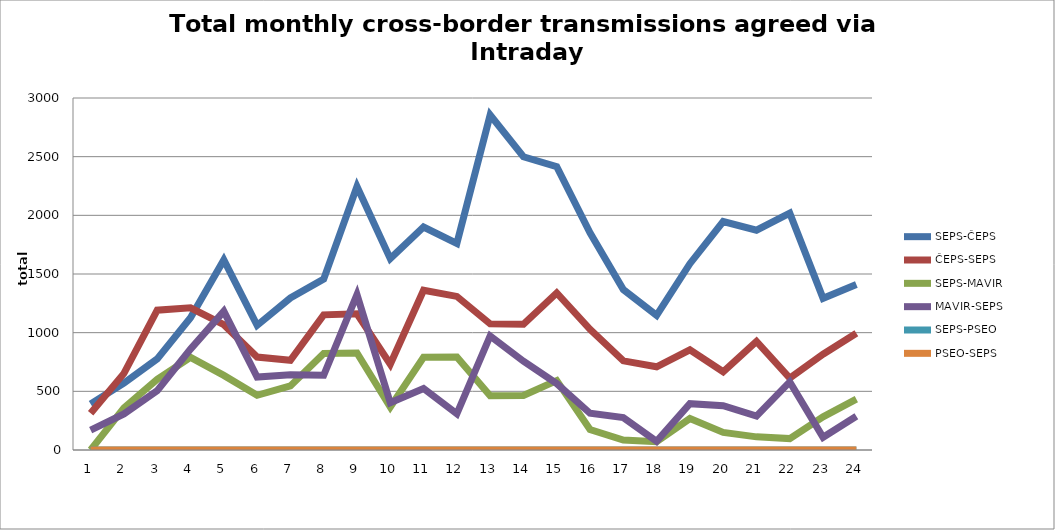
| Category | SEPS-ČEPS | ČEPS-SEPS | SEPS-MAVIR | MAVIR-SEPS | SEPS-PSEO | PSEO-SEPS |
|---|---|---|---|---|---|---|
| 1.0 | 392 | 313 | 0 | 169 | 0 | 0 |
| 2.0 | 571 | 653 | 359 | 308 | 0 | 0 |
| 3.0 | 776 | 1192 | 602 | 506 | 0 | 0 |
| 4.0 | 1127 | 1212 | 790 | 860 | 0 | 0 |
| 5.0 | 1620 | 1068 | 636 | 1182 | 0 | 0 |
| 6.0 | 1062 | 792 | 466 | 622 | 0 | 0 |
| 7.0 | 1296 | 764 | 546 | 641 | 0 | 0 |
| 8.0 | 1456 | 1152 | 823 | 637 | 0 | 0 |
| 9.0 | 2245 | 1161 | 827 | 1324 | 0 | 0 |
| 10.0 | 1631 | 731 | 366 | 402 | 0 | 0 |
| 11.0 | 1900 | 1362 | 791 | 524 | 0 | 0 |
| 12.0 | 1760 | 1309 | 793 | 308 | 0 | 0 |
| 13.0 | 2855 | 1075 | 463 | 972 | 0 | 0 |
| 14.0 | 2499 | 1072 | 464 | 757 | 0 | 0 |
| 15.0 | 2414 | 1338 | 591 | 566 | 0 | 0 |
| 16.0 | 1851 | 1028 | 174 | 313 | 0 | 0 |
| 17.0 | 1367 | 760 | 85 | 276 | 0 | 0 |
| 18.0 | 1148 | 709 | 71 | 74 | 0 | 0 |
| 19.0 | 1588 | 854 | 268 | 395 | 0 | 0 |
| 20.0 | 1947 | 667 | 150 | 377 | 0 | 0 |
| 21.0 | 1873 | 926 | 112 | 289 | 0 | 0 |
| 22.0 | 2018 | 613 | 97 | 581 | 0 | 0 |
| 23.0 | 1293 | 816 | 283 | 108 | 0 | 0 |
| 24.0 | 1411 | 995 | 434 | 287 | 0 | 0 |